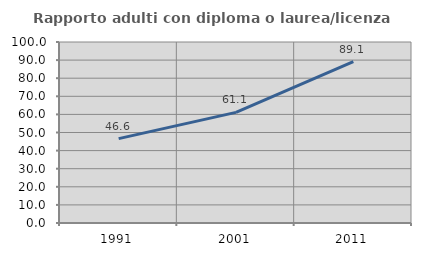
| Category | Rapporto adulti con diploma o laurea/licenza media  |
|---|---|
| 1991.0 | 46.629 |
| 2001.0 | 61.115 |
| 2011.0 | 89.146 |